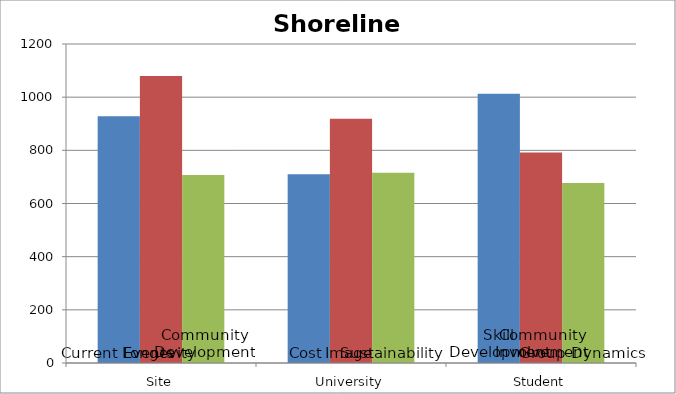
| Category | Alignment1 | Alignment2 | Alignment3 |
|---|---|---|---|
| 0 | 928.125 | 1080 | 707.5 |
| 1 | 710 | 918.75 | 715.625 |
| 2 | 1012.5 | 791.875 | 677.5 |